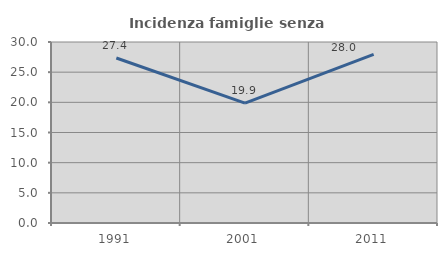
| Category | Incidenza famiglie senza nuclei |
|---|---|
| 1991.0 | 27.35 |
| 2001.0 | 19.862 |
| 2011.0 | 27.955 |